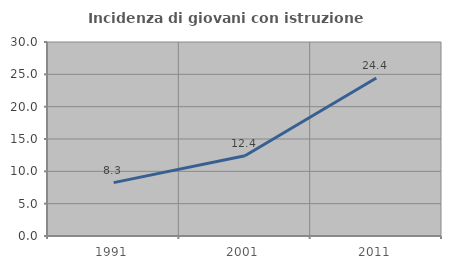
| Category | Incidenza di giovani con istruzione universitaria |
|---|---|
| 1991.0 | 8.254 |
| 2001.0 | 12.421 |
| 2011.0 | 24.43 |